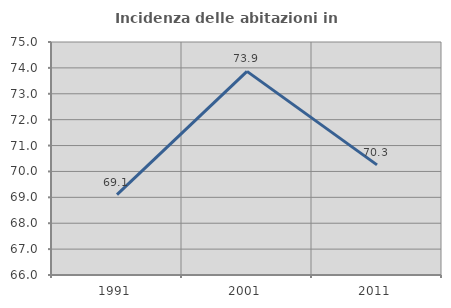
| Category | Incidenza delle abitazioni in proprietà  |
|---|---|
| 1991.0 | 69.107 |
| 2001.0 | 73.866 |
| 2011.0 | 70.253 |